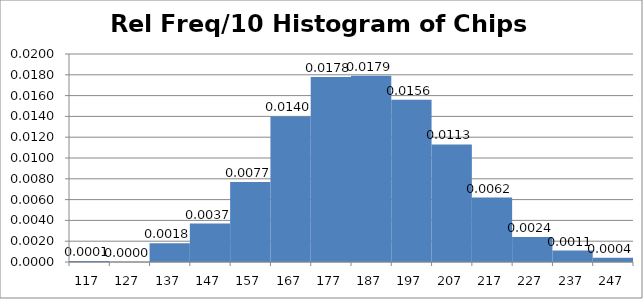
| Category | Rel Freq/10 Histogram of Chips |
|---|---|
| 117.0 | 0 |
| 127.0 | 0 |
| 137.0 | 0.002 |
| 147.0 | 0.004 |
| 157.0 | 0.008 |
| 167.0 | 0.014 |
| 177.0 | 0.018 |
| 187.0 | 0.018 |
| 197.0 | 0.016 |
| 207.0 | 0.011 |
| 217.0 | 0.006 |
| 227.0 | 0.002 |
| 237.0 | 0.001 |
| 247.0 | 0 |